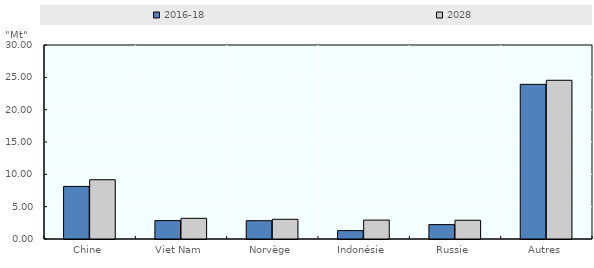
| Category | 2016-18 | 2028 |
|---|---|---|
| Chine | 8.13 | 9.164 |
| Viet Nam | 2.846 | 3.197 |
| Norvège | 2.83 | 3.049 |
| Indonésie | 1.295 | 2.922 |
| Russie | 2.224 | 2.899 |
| Autres | 23.916 | 24.542 |